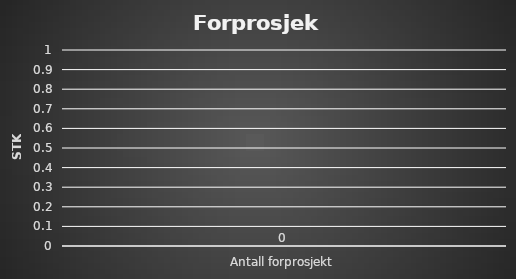
| Category | Series 0 |
|---|---|
| Antall forprosjekt | 0 |